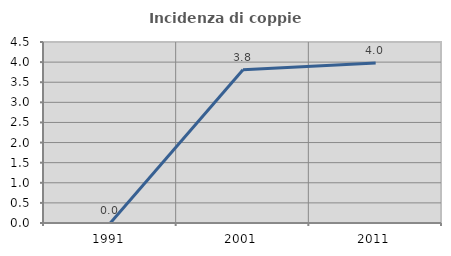
| Category | Incidenza di coppie miste |
|---|---|
| 1991.0 | 0 |
| 2001.0 | 3.81 |
| 2011.0 | 3.98 |